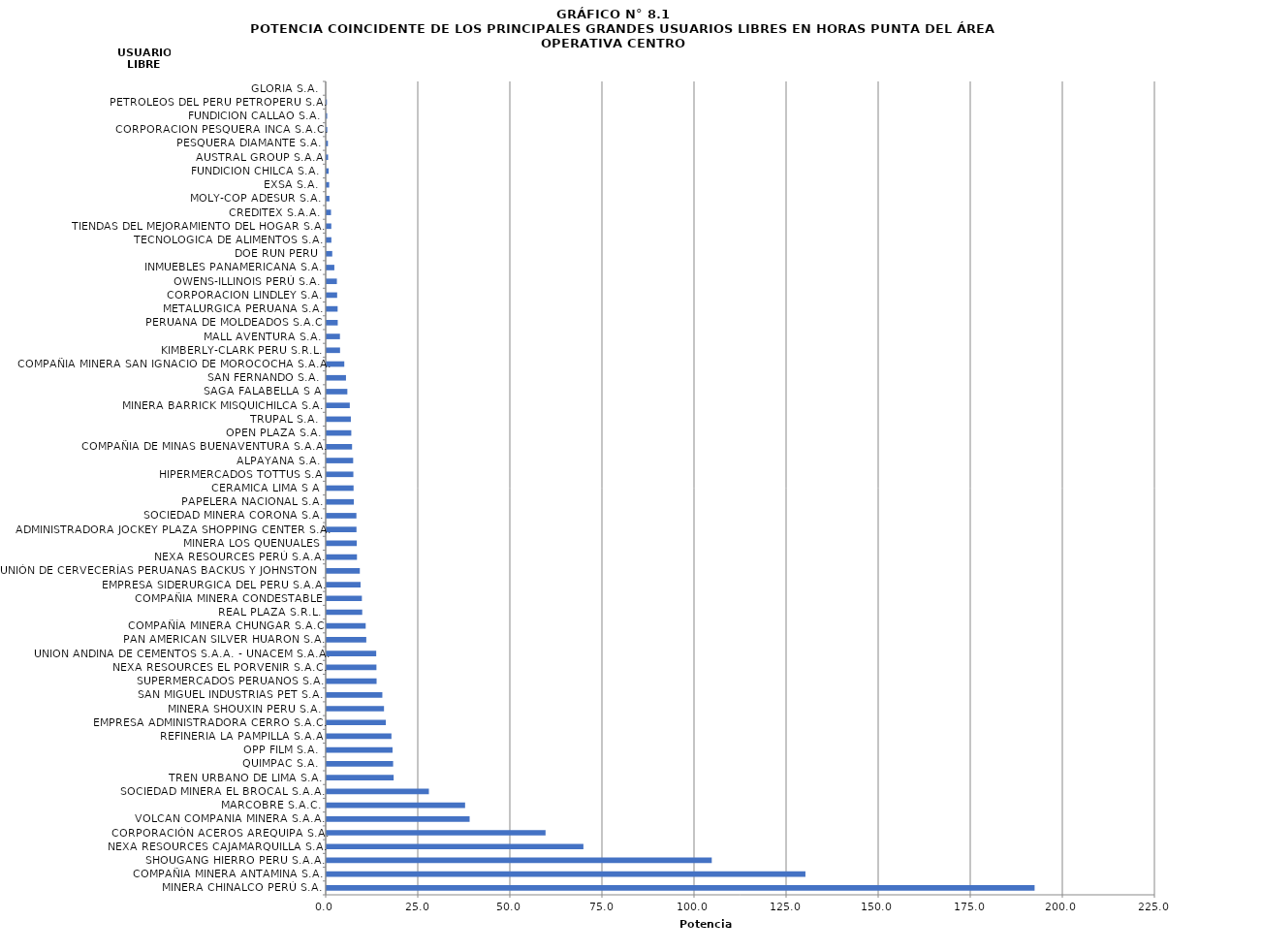
| Category | Series 0 |
|---|---|
| MINERA CHINALCO PERÚ S.A. | 192.21 |
| COMPAÑIA MINERA ANTAMINA S.A. | 129.99 |
| SHOUGANG HIERRO PERU S.A.A. | 104.56 |
| NEXA RESOURCES CAJAMARQUILLA S.A. | 69.71 |
| CORPORACIÓN ACEROS AREQUIPA S.A. | 59.43 |
| VOLCAN COMPANIA MINERA S.A.A. | 38.82 |
| MARCOBRE S.A.C. | 37.59 |
| SOCIEDAD MINERA EL BROCAL S.A.A. | 27.76 |
| TREN URBANO DE LIMA S.A. | 18.19 |
| QUIMPAC S.A. | 18.05 |
| OPP FILM S.A. | 17.89 |
| REFINERIA LA PAMPILLA S.A.A | 17.59 |
| EMPRESA ADMINISTRADORA CERRO S.A.C. | 16.07 |
| MINERA SHOUXIN PERU S.A. | 15.57 |
| SAN MIGUEL INDUSTRIAS PET S.A. | 15.12 |
| SUPERMERCADOS PERUANOS S.A. | 13.56 |
| NEXA RESOURCES EL PORVENIR S.A.C. | 13.52 |
| UNION ANDINA DE CEMENTOS S.A.A. - UNACEM S.A.A. | 13.46 |
| PAN AMERICAN SILVER HUARON S.A. | 10.76 |
| COMPAÑÍA MINERA CHUNGAR S.A.C | 10.6 |
| REAL PLAZA S.R.L. | 9.66 |
| COMPAÑIA MINERA CONDESTABLE | 9.57 |
| EMPRESA SIDERURGICA DEL PERU S.A.A. | 9.21 |
| UNIÓN DE CERVECERÍAS PERUANAS BACKUS Y JOHNSTON S. | 9.01 |
| NEXA RESOURCES PERÚ S.A.A. | 8.23 |
| MINERA LOS QUENUALES | 8.18 |
| ADMINISTRADORA JOCKEY PLAZA SHOPPING CENTER S.A. | 8.1 |
| SOCIEDAD MINERA CORONA S.A. | 8.08 |
| PAPELERA NACIONAL S.A. | 7.38 |
| CERAMICA LIMA S A | 7.31 |
| HIPERMERCADOS TOTTUS S.A | 7.25 |
| ALPAYANA S.A. | 7.2 |
| COMPAÑIA DE MINAS BUENAVENTURA S.A.A. | 6.9 |
| OPEN PLAZA S.A. | 6.69 |
| TRUPAL S.A. | 6.57 |
| MINERA BARRICK MISQUICHILCA S.A. | 6.28 |
| SAGA FALABELLA S A | 5.62 |
| SAN FERNANDO S.A. | 5.25 |
| COMPAÑIA MINERA SAN IGNACIO DE MOROCOCHA S.A.A. | 4.79 |
| KIMBERLY-CLARK PERU S.R.L. | 3.64 |
| MALL AVENTURA S.A. | 3.61 |
| PERUANA DE MOLDEADOS S.A.C | 3.01 |
| METALURGICA PERUANA S.A. | 2.98 |
| CORPORACION LINDLEY S.A. | 2.85 |
| OWENS-ILLINOIS PERÚ S.A. | 2.78 |
| INMUEBLES PANAMERICANA S.A. | 2.09 |
| DOE RUN PERU | 1.52 |
| TECNOLOGICA DE ALIMENTOS S.A. | 1.28 |
| TIENDAS DEL MEJORAMIENTO DEL HOGAR S.A. | 1.26 |
| CREDITEX S.A.A. | 1.18 |
| MOLY-COP ADESUR S.A. | 0.77 |
| EXSA S.A. | 0.69 |
| FUNDICION CHILCA S.A. | 0.55 |
| AUSTRAL GROUP S.A.A | 0.39 |
| PESQUERA DIAMANTE S.A. | 0.35 |
| CORPORACION PESQUERA INCA S.A.C. | 0.17 |
| FUNDICION CALLAO S.A. | 0.14 |
| PETROLEOS DEL PERU PETROPERU S.A. | 0.07 |
| GLORIA S.A. | 0 |